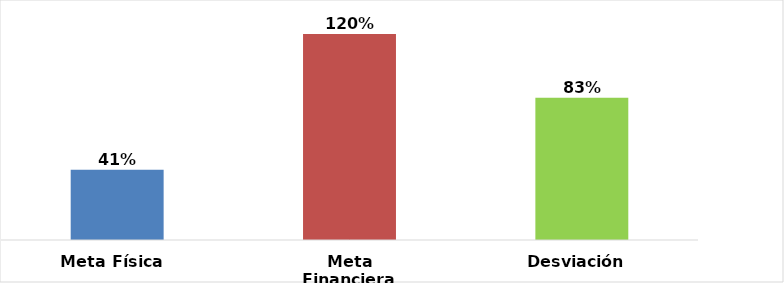
| Category | Meta Física  |
|---|---|
| Meta Física  | 0.41 |
| Meta Financiera | 1.201 |
| Desviación  | 0.83 |